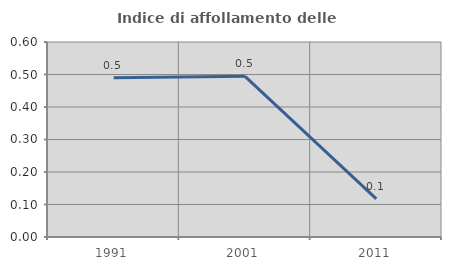
| Category | Indice di affollamento delle abitazioni  |
|---|---|
| 1991.0 | 0.49 |
| 2001.0 | 0.494 |
| 2011.0 | 0.117 |